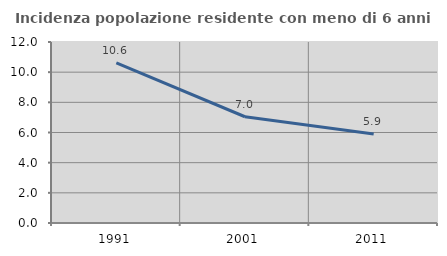
| Category | Incidenza popolazione residente con meno di 6 anni |
|---|---|
| 1991.0 | 10.615 |
| 2001.0 | 7.044 |
| 2011.0 | 5.907 |